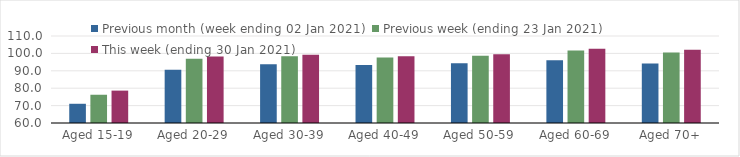
| Category | Previous month (week ending 02 Jan 2021) | Previous week (ending 23 Jan 2021) | This week (ending 30 Jan 2021) |
|---|---|---|---|
| Aged 15-19 | 71.05 | 76.24 | 78.61 |
| Aged 20-29 | 90.64 | 96.95 | 98.2 |
| Aged 30-39 | 93.73 | 98.36 | 99.18 |
| Aged 40-49 | 93.29 | 97.6 | 98.42 |
| Aged 50-59 | 94.33 | 98.69 | 99.58 |
| Aged 60-69 | 96.04 | 101.66 | 102.68 |
| Aged 70+ | 94.22 | 100.5 | 102.07 |